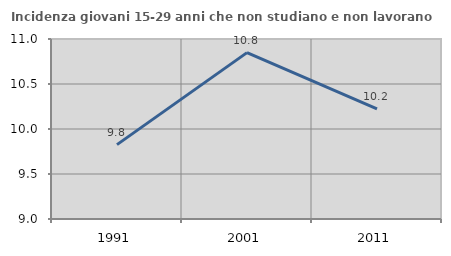
| Category | Incidenza giovani 15-29 anni che non studiano e non lavorano  |
|---|---|
| 1991.0 | 9.827 |
| 2001.0 | 10.848 |
| 2011.0 | 10.223 |